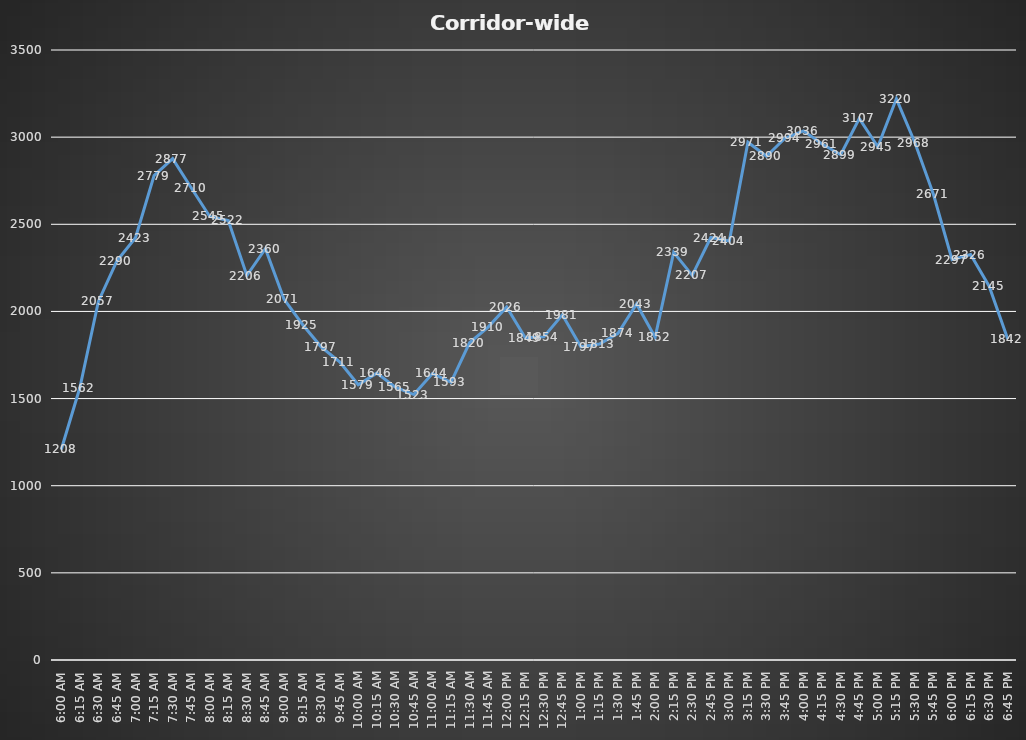
| Category | Corridor-wide Volume |
|---|---|
| 6:00 AM | 1208 |
| 6:15 AM | 1562 |
| 6:30 AM | 2057 |
| 6:45 AM | 2290 |
| 7:00 AM | 2423 |
| 7:15 AM | 2779 |
| 7:30 AM | 2877 |
| 7:45 AM | 2710 |
| 8:00 AM | 2545 |
| 8:15 AM | 2522 |
| 8:30 AM | 2206 |
| 8:45 AM | 2360 |
| 9:00 AM | 2071 |
| 9:15 AM | 1925 |
| 9:30 AM | 1797 |
| 9:45 AM | 1711 |
| 10:00 AM | 1579 |
| 10:15 AM | 1646 |
| 10:30 AM | 1565 |
| 10:45 AM | 1523 |
| 11:00 AM | 1644 |
| 11:15 AM | 1593 |
| 11:30 AM | 1820 |
| 11:45 AM | 1910 |
| 12:00 PM | 2026 |
| 12:15 PM | 1849 |
| 12:30 PM | 1854 |
| 12:45 PM | 1981 |
| 1:00 PM | 1797 |
| 1:15 PM | 1813 |
| 1:30 PM | 1874 |
| 1:45 PM | 2043 |
| 2:00 PM | 1852 |
| 2:15 PM | 2339 |
| 2:30 PM | 2207 |
| 2:45 PM | 2424 |
| 3:00 PM | 2404 |
| 3:15 PM | 2971 |
| 3:30 PM | 2890 |
| 3:45 PM | 2994 |
| 4:00 PM | 3036 |
| 4:15 PM | 2961 |
| 4:30 PM | 2899 |
| 4:45 PM | 3107 |
| 5:00 PM | 2945 |
| 5:15 PM | 3220 |
| 5:30 PM | 2968 |
| 5:45 PM | 2671 |
| 6:00 PM | 2297 |
| 6:15 PM | 2326 |
| 6:30 PM | 2145 |
| 6:45 PM | 1842 |